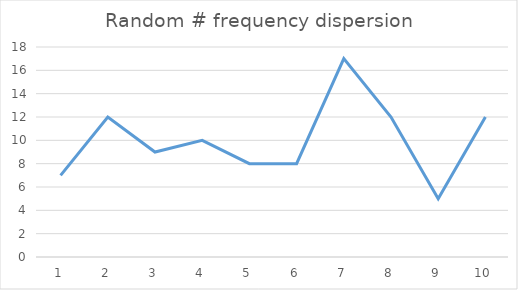
| Category | Series 0 |
|---|---|
| 0 | 7 |
| 1 | 12 |
| 2 | 9 |
| 3 | 10 |
| 4 | 8 |
| 5 | 8 |
| 6 | 17 |
| 7 | 12 |
| 8 | 5 |
| 9 | 12 |